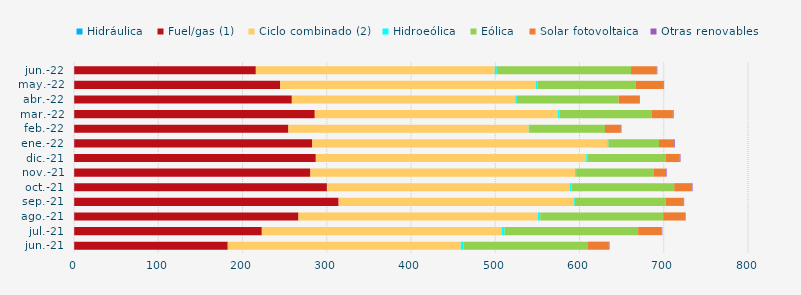
| Category | Hidráulica | Fuel/gas (1) | Ciclo combinado (2) | Hidroeólica | Eólica | Solar fotovoltaica | Otras renovables |
|---|---|---|---|---|---|---|---|
| jun.-21 | 0.282 | 182.213 | 276.616 | 3.002 | 148.018 | 24.742 | 0.724 |
| jul.-21 | 0.29 | 222.639 | 284.61 | 3.578 | 158.516 | 27.938 | 0.734 |
| ago.-21 | 0.281 | 266.149 | 284.301 | 2.663 | 145.95 | 26.121 | 0.57 |
| sep.-21 | 0.278 | 313.815 | 278.888 | 1.42 | 107.853 | 21.565 | 0.4 |
| oct.-21 | 0.282 | 299.917 | 288.429 | 1.853 | 121.987 | 20.979 | 0.756 |
| nov.-21 | 0.231 | 280.341 | 314.273 | 1.14 | 91.77 | 14.946 | 0.753 |
| dic.-21 | 0.155 | 286.856 | 321.013 | 1.228 | 92.868 | 16.937 | 0.822 |
| ene.-22 | 0.294 | 282.523 | 350.314 | 1.111 | 60.148 | 17.957 | 0.861 |
| feb.-22 | 0.251 | 254.215 | 285.333 | 1.482 | 88.982 | 18.799 | 0.721 |
| mar.-22 | 0.296 | 285.489 | 288.518 | 2.126 | 109.436 | 24.968 | 0.91 |
| abr.-22 | 0.274 | 258.292 | 265.373 | 1.753 | 120.763 | 24.757 | 0.614 |
| may.-22 | 0.299 | 244.426 | 303.457 | 1.917 | 116.793 | 32.833 | 0.721 |
| jun.-22 | 0.281 | 215.547 | 283.584 | 2.45 | 159.317 | 30.519 | 0.696 |